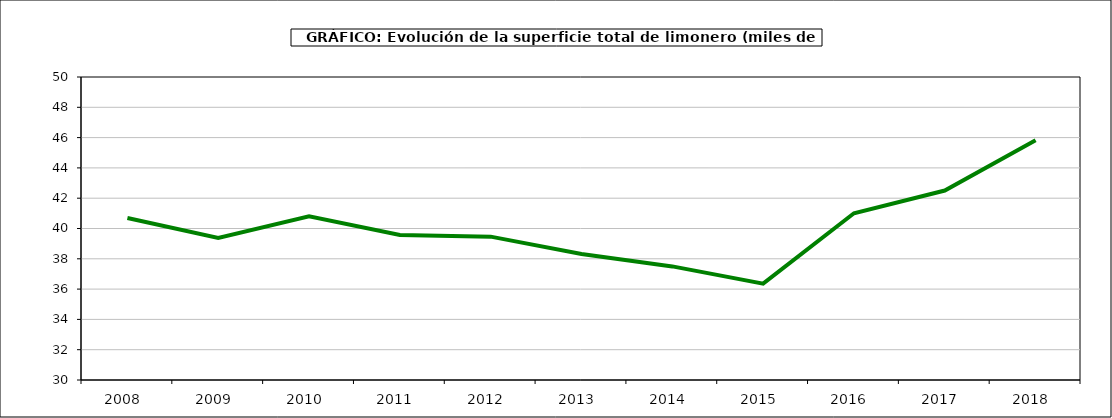
| Category | superficie |
|---|---|
| 2008.0 | 40.689 |
| 2009.0 | 39.371 |
| 2010.0 | 40.801 |
| 2011.0 | 39.571 |
| 2012.0 | 39.463 |
| 2013.0 | 38.319 |
| 2014.0 | 37.498 |
| 2015.0 | 36.363 |
| 2016.0 | 41.009 |
| 2017.0 | 42.507 |
| 2018.0 | 45.832 |